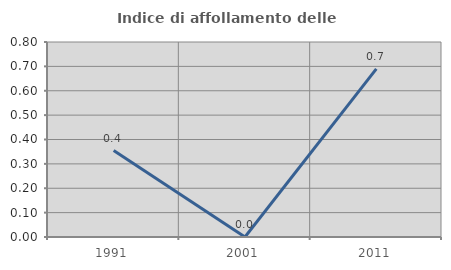
| Category | Indice di affollamento delle abitazioni  |
|---|---|
| 1991.0 | 0.355 |
| 2001.0 | 0 |
| 2011.0 | 0.69 |